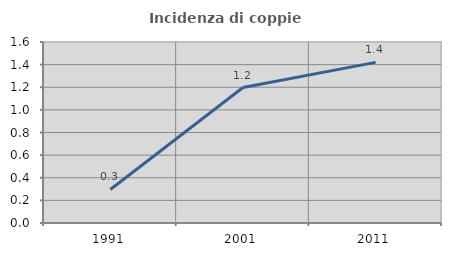
| Category | Incidenza di coppie miste |
|---|---|
| 1991.0 | 0.296 |
| 2001.0 | 1.198 |
| 2011.0 | 1.42 |